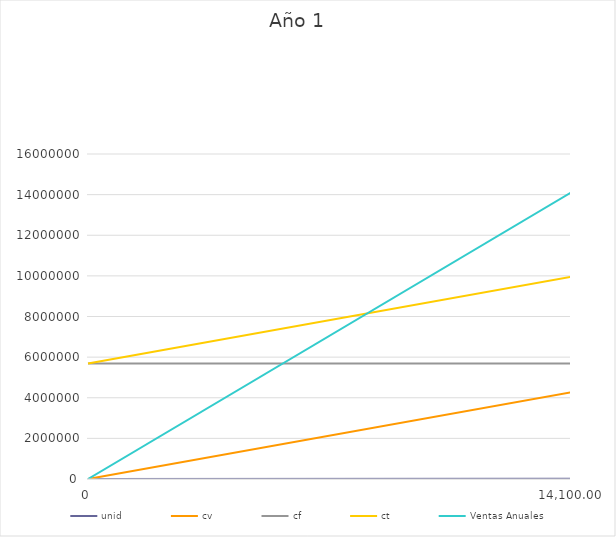
| Category | unid | cv | cf | ct | Ventas Anuales |
|---|---|---|---|---|---|
| 0.0 | 0 | 0 | 5681262.178 | 5681262.178 | 0 |
| 14100.0 | 14100 | 4270489.827 | 5681262.178 | 9951752.005 | 14100000 |